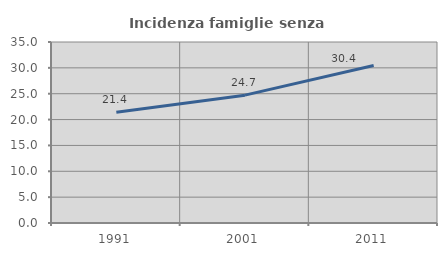
| Category | Incidenza famiglie senza nuclei |
|---|---|
| 1991.0 | 21.42 |
| 2001.0 | 24.721 |
| 2011.0 | 30.445 |